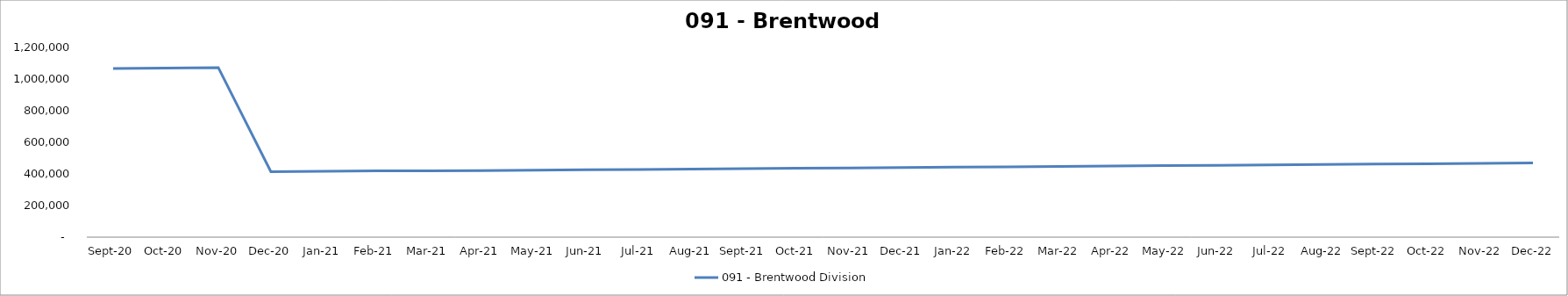
| Category | 091 - Brentwood Division |
|---|---|
| 2020-09-30 | 1066699.71 |
| 2020-10-31 | 1069718.64 |
| 2020-11-30 | 1072737.57 |
| 2020-12-31 | 413683.63 |
| 2021-01-31 | 416277.53 |
| 2021-02-28 | 418775.73 |
| 2021-03-31 | 419136.47 |
| 2021-04-30 | 421463.189 |
| 2021-05-31 | 423789.908 |
| 2021-06-30 | 426116.627 |
| 2021-07-31 | 428443.346 |
| 2021-08-31 | 430770.065 |
| 2021-09-30 | 433096.785 |
| 2021-10-31 | 435423.504 |
| 2021-11-30 | 437799.495 |
| 2021-12-31 | 440175.486 |
| 2022-01-31 | 442593.826 |
| 2022-02-28 | 445012.165 |
| 2022-03-31 | 447430.505 |
| 2022-04-30 | 449848.845 |
| 2022-05-31 | 452267.184 |
| 2022-06-30 | 454685.524 |
| 2022-07-31 | 457103.863 |
| 2022-08-31 | 459522.203 |
| 2022-09-30 | 461940.543 |
| 2022-10-31 | 464408.154 |
| 2022-11-30 | 466875.766 |
| 2022-12-31 | 469385.726 |